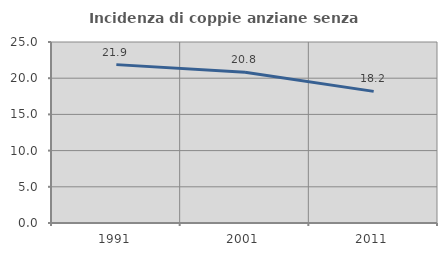
| Category | Incidenza di coppie anziane senza figli  |
|---|---|
| 1991.0 | 21.875 |
| 2001.0 | 20.833 |
| 2011.0 | 18.182 |